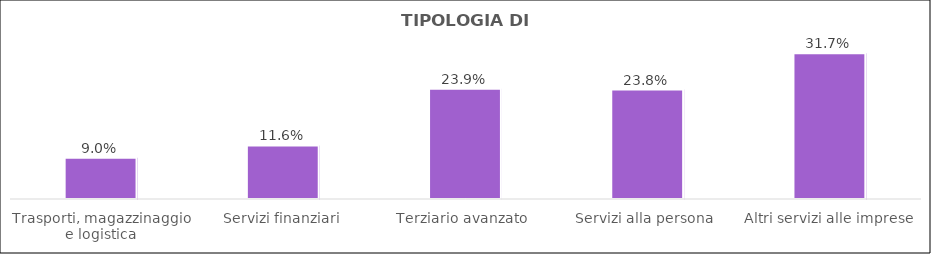
| Category | Series 0 |
|---|---|
| Trasporti, magazzinaggio e logistica | 0.09 |
| Servizi finanziari | 0.116 |
| Terziario avanzato  | 0.239 |
| Servizi alla persona  | 0.238 |
| Altri servizi alle imprese | 0.317 |